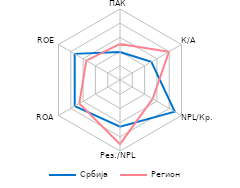
| Category | Србија | Регион |
|---|---|---|
| ПАК | 1.967 | 2.543 |
| К/А | 2.55 | 3.977 |
| NPL/Кр. | 4.453 | 2.658 |
| Рез./NPL | 3.289 | 4.52 |
| ROA | 3.68 | 3.308 |
| ROE | 3.684 | 2.735 |